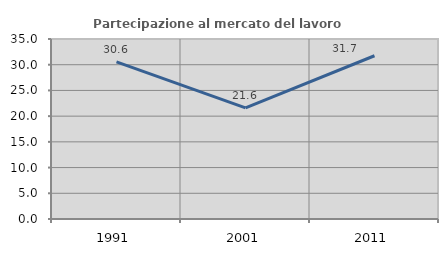
| Category | Partecipazione al mercato del lavoro  femminile |
|---|---|
| 1991.0 | 30.556 |
| 2001.0 | 21.6 |
| 2011.0 | 31.746 |